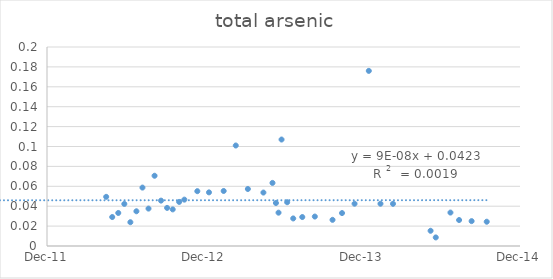
| Category | Series 0 |
|---|---|
| 41017.0 | 0.049 |
| 41031.0 | 0.029 |
| 41045.0 | 0.033 |
| 41059.0 | 0.042 |
| 41073.0 | 0.024 |
| 41087.0 | 0.035 |
| 41101.0 | 0.059 |
| 41115.0 | 0.038 |
| 41129.0 | 0.071 |
| 41144.0 | 0.046 |
| 41158.0 | 0.038 |
| 41171.0 | 0.037 |
| 41186.0 | 0.044 |
| 41198.0 | 0.047 |
| 41228.0 | 0.055 |
| 41255.0 | 0.054 |
| 41289.0 | 0.055 |
| 41317.0 | 0.101 |
| 41345.0 | 0.057 |
| 41381.0 | 0.054 |
| 41402.0 | 0.063 |
| 41410.0 | 0.043 |
| 41416.0 | 0.034 |
| 41423.0 | 0.107 |
| 41436.0 | 0.044 |
| 41450.0 | 0.028 |
| 41471.0 | 0.029 |
| 41500.0 | 0.03 |
| 41541.0 | 0.026 |
| 41563.0 | 0.033 |
| 41592.0 | 0.042 |
| 41625.0 | 0.176 |
| 41652.0 | 0.042 |
| 41681.0 | 0.042 |
| 41768.0 | 0.015 |
| 41780.0 | 0.009 |
| 41814.0 | 0.034 |
| 41834.0 | 0.026 |
| 41863.0 | 0.025 |
| 41898.0 | 0.024 |